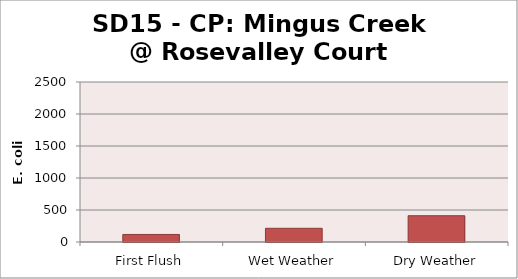
| Category | E. coli MPN |
|---|---|
| First Flush | 117.8 |
| Wet Weather | 214.2 |
| Dry Weather | 410.6 |